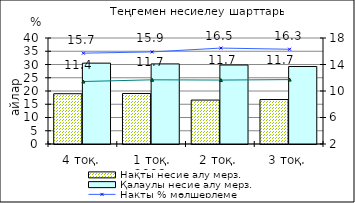
| Category | Нақты несие алу мерз. | Қалаулы несие алу мерз. |
|---|---|---|
| 4 тоқ. | 18.97 | 30.51 |
| 1 тоқ. 2008  | 19.04 | 30.22 |
| 2 тоқ. | 16.58 | 29.81 |
| 3 тоқ. | 16.78 | 29.25 |